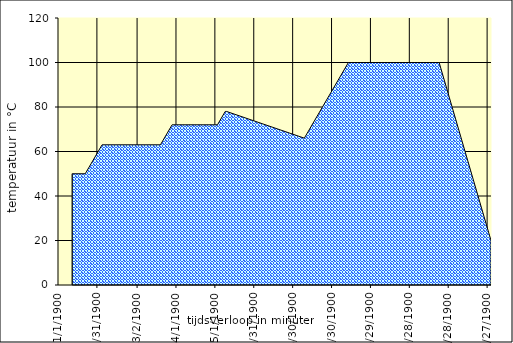
| Category | Maischschema grafisch |
|---|---|
| 0.0 | 38 |
| 0.0 | 38 |
| 12.0 | 50 |
| 22.0 | 50 |
| 35.0 | 63 |
| 80.0 | 63 |
| 89.0 | 72 |
| 124.0 | 72 |
| 130.0 | 78 |
| 131.0 | 78 |
| 131.0 | 78 |
| 191.0 | 66 |
| 225.0 | 100 |
| 295.0 | 100 |
| 295.0 | 100 |
| 335.0 | 20 |